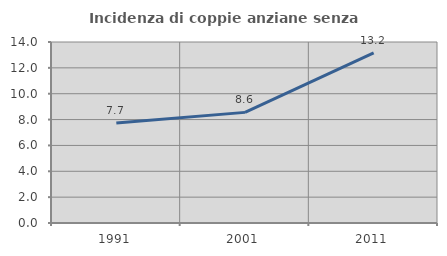
| Category | Incidenza di coppie anziane senza figli  |
|---|---|
| 1991.0 | 7.731 |
| 2001.0 | 8.557 |
| 2011.0 | 13.156 |